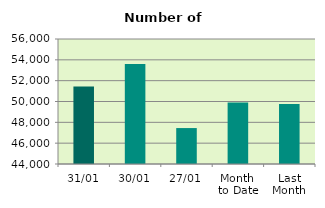
| Category | Series 0 |
|---|---|
| 31/01 | 51430 |
| 30/01 | 53610 |
| 27/01 | 47450 |
| Month 
to Date | 49894.952 |
| Last
Month | 49764 |